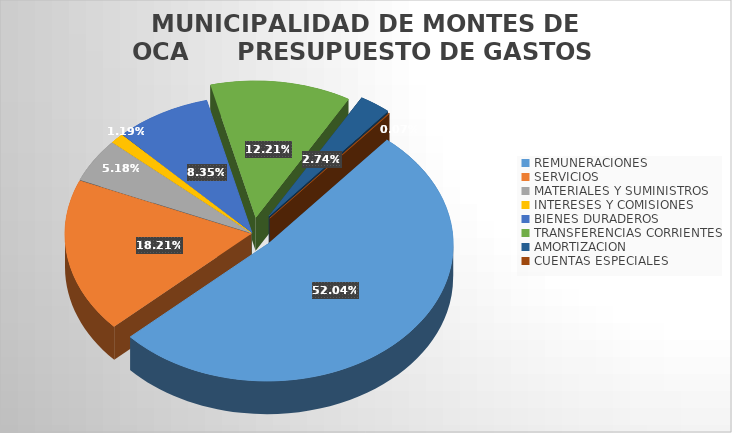
| Category | Series 0 |
|---|---|
| REMUNERACIONES | 2903748329.66 |
| SERVICIOS  | 1016290607.3 |
| MATERIALES Y SUMINISTROS | 289050699.28 |
| INTERESES Y COMISIONES  | 66334420.27 |
| BIENES DURADEROS | 466157642.17 |
| TRANSFERENCIAS CORRIENTES | 681401922.32 |
| AMORTIZACION  | 152614339.19 |
| CUENTAS ESPECIALES | 4146627.42 |